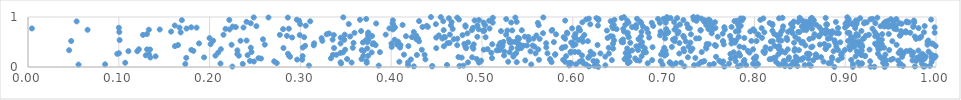
| Category | Series 0 |
|---|---|
| 0.9435141385175999 | 0.001 |
| 0.9084288971514204 | 0.002 |
| 0.8880947690722107 | 0.003 |
| 0.628026446844812 | 0.004 |
| 0.9321128601831961 | 0.005 |
| 0.9865255477891635 | 0.006 |
| 0.9278212670340489 | 0.007 |
| 0.7668587768886409 | 0.008 |
| 0.22507568513316045 | 0.009 |
| 0.8394012127995558 | 0.01 |
| 0.6178031120283696 | 0.011 |
| 0.9767485609237834 | 0.012 |
| 0.42494053328763504 | 0.013 |
| 0.7228866971198246 | 0.014 |
| 0.4448520454053059 | 0.015 |
| 0.7818662722988369 | 0.016 |
| 0.44540230513710366 | 0.017 |
| 0.8336374554361493 | 0.018 |
| 0.8473525703792806 | 0.019 |
| 0.9636773305580686 | 0.02 |
| 0.9932818365566519 | 0.021 |
| 0.475260327885379 | 0.022 |
| 0.6238320365783764 | 0.023 |
| 0.9882404270761533 | 0.024 |
| 0.8620616347082107 | 0.025 |
| 0.8013576877919077 | 0.026 |
| 0.47946430670365237 | 0.027 |
| 0.3862320885327105 | 0.028 |
| 0.3094214604411192 | 0.029 |
| 0.8403205275369019 | 0.03 |
| 0.5961232999273615 | 0.031 |
| 0.784754832634466 | 0.032 |
| 0.9158591251884615 | 0.033 |
| 0.6358777440192309 | 0.034 |
| 0.7100502725932303 | 0.035 |
| 0.4185945826810302 | 0.036 |
| 0.7336318142562891 | 0.037 |
| 0.7909183708939838 | 0.038 |
| 0.8553732623515314 | 0.039 |
| 0.9597024253832728 | 0.04 |
| 0.4614372961981086 | 0.041 |
| 0.8025614220324851 | 0.042 |
| 0.8034377014498689 | 0.043 |
| 0.7506864057592679 | 0.044 |
| 0.6989292244538539 | 0.045 |
| 0.8286363449986983 | 0.046 |
| 0.8270068750161812 | 0.047 |
| 0.05564668857978383 | 0.048 |
| 0.6146939725939228 | 0.049 |
| 0.9452851322320792 | 0.05 |
| 0.8603343276518199 | 0.051 |
| 0.5541808769718293 | 0.052 |
| 0.08493068262620929 | 0.053 |
| 0.6035408192104315 | 0.054 |
| 0.7094698329048269 | 0.055 |
| 0.9085348400150789 | 0.056 |
| 0.8341292525490099 | 0.057 |
| 0.8037658858891946 | 0.058 |
| 0.7386931026975604 | 0.059 |
| 0.17323263273371303 | 0.06 |
| 0.843430276609089 | 0.061 |
| 0.23652005693875178 | 0.062 |
| 0.7553407661391937 | 0.063 |
| 0.9609606586618787 | 0.064 |
| 0.7984970587532397 | 0.065 |
| 0.7720598693835035 | 0.066 |
| 0.9844515701339607 | 0.067 |
| 0.9181361390796628 | 0.068 |
| 0.21198326543716162 | 0.069 |
| 0.3448616093847905 | 0.07 |
| 0.803062395204101 | 0.071 |
| 0.9183280397652249 | 0.072 |
| 0.8448207286356256 | 0.073 |
| 0.6117462422665264 | 0.074 |
| 0.6825237214495554 | 0.075 |
| 0.8816320289399248 | 0.076 |
| 0.7136475046084222 | 0.077 |
| 0.6607260725389088 | 0.078 |
| 0.27397489191241975 | 0.079 |
| 0.5980288233540304 | 0.08 |
| 0.9417392830158506 | 0.081 |
| 0.5961131611034594 | 0.082 |
| 0.8841406389262182 | 0.083 |
| 0.3730175445998012 | 0.084 |
| 0.10707982698208474 | 0.085 |
| 0.7067614147741073 | 0.086 |
| 0.7192534083729213 | 0.087 |
| 0.49663971114465955 | 0.088 |
| 0.35637734175507696 | 0.089 |
| 0.4184989490279276 | 0.09 |
| 0.7635894636873023 | 0.091 |
| 0.4845306553572182 | 0.092 |
| 0.914236162547848 | 0.093 |
| 0.3442242560586368 | 0.094 |
| 0.7068743073014219 | 0.095 |
| 0.7410971792819275 | 0.096 |
| 0.5382661882569967 | 0.097 |
| 0.576602034867824 | 0.098 |
| 0.8240215202730105 | 0.099 |
| 0.842693436385164 | 0.1 |
| 0.6262883866531663 | 0.101 |
| 0.6626715377488874 | 0.102 |
| 0.9952167824005834 | 0.103 |
| 0.5916329879165847 | 0.104 |
| 0.4089512369712137 | 0.105 |
| 0.5288659126670202 | 0.106 |
| 0.7434441293883413 | 0.107 |
| 0.8761490184337252 | 0.108 |
| 0.6075198771472788 | 0.109 |
| 0.24873711022167078 | 0.11 |
| 0.7657430486895122 | 0.111 |
| 0.7882248398491215 | 0.112 |
| 0.2711384705225066 | 0.113 |
| 0.6264167185956734 | 0.114 |
| 0.9275266226725014 | 0.115 |
| 0.779401156650229 | 0.116 |
| 0.7448229101388014 | 0.117 |
| 0.37273688162585705 | 0.118 |
| 0.6967532974647325 | 0.119 |
| 0.6227253981576489 | 0.12 |
| 0.24443361491462678 | 0.121 |
| 0.9781912035715612 | 0.122 |
| 0.8324313108101445 | 0.123 |
| 0.7613934552696022 | 0.124 |
| 0.4990488829159021 | 0.125 |
| 0.6101440682426211 | 0.126 |
| 0.8476217849040943 | 0.127 |
| 0.6734285889484047 | 0.128 |
| 0.9583123329467871 | 0.129 |
| 0.9450411955072819 | 0.13 |
| 0.9741321816108763 | 0.131 |
| 0.54768970047063 | 0.132 |
| 0.6596502156816774 | 0.133 |
| 0.8647230473309191 | 0.134 |
| 0.6705387450810054 | 0.135 |
| 0.8922960266278387 | 0.136 |
| 0.6430126263218102 | 0.137 |
| 0.6873853587969818 | 0.138 |
| 0.7889885758238244 | 0.139 |
| 0.9832227718085348 | 0.14 |
| 0.9066192444755617 | 0.141 |
| 0.9846726935649228 | 0.142 |
| 0.5893819164875 | 0.143 |
| 0.5627384160353995 | 0.144 |
| 0.9503247079982249 | 0.145 |
| 0.3019914128243669 | 0.146 |
| 0.8520908201450087 | 0.147 |
| 0.29641162763697637 | 0.148 |
| 0.9848061187155219 | 0.149 |
| 0.5751275516147146 | 0.15 |
| 0.4216415765260272 | 0.151 |
| 0.8510289660863317 | 0.152 |
| 0.4376542269973591 | 0.153 |
| 0.8374064922402412 | 0.154 |
| 0.816733854584339 | 0.155 |
| 0.6569936727038088 | 0.156 |
| 0.5749413976711607 | 0.157 |
| 0.367325706435899 | 0.158 |
| 0.3514196145559376 | 0.159 |
| 0.8477160492246847 | 0.16 |
| 0.8190122347763199 | 0.161 |
| 0.4941073983302974 | 0.162 |
| 0.9525349230147732 | 0.163 |
| 0.9873912280539967 | 0.164 |
| 0.8857105298019818 | 0.165 |
| 0.8011678967298949 | 0.166 |
| 0.85929710926485 | 0.167 |
| 0.8461778457724604 | 0.168 |
| 0.2566217904529745 | 0.169 |
| 0.7740760130297377 | 0.17 |
| 0.6687050691685186 | 0.171 |
| 0.7993096496653893 | 0.172 |
| 0.9973931144365776 | 0.173 |
| 0.3336082084267009 | 0.174 |
| 0.9401045170864456 | 0.175 |
| 0.9430429024629676 | 0.176 |
| 0.2538297810334048 | 0.177 |
| 0.5110359578787965 | 0.178 |
| 0.9955253639912921 | 0.179 |
| 0.853908656906808 | 0.18 |
| 0.7349562953569444 | 0.181 |
| 0.8962422598696603 | 0.182 |
| 0.17429521821063498 | 0.183 |
| 0.8216300108126642 | 0.184 |
| 0.6170969576169659 | 0.185 |
| 0.9789864269489768 | 0.186 |
| 0.8232084852190503 | 0.187 |
| 0.4776275764555077 | 0.188 |
| 0.9952241513268374 | 0.189 |
| 0.13475074266772558 | 0.19 |
| 0.8381336586003342 | 0.191 |
| 0.19392688567500704 | 0.192 |
| 0.8854837261667257 | 0.193 |
| 0.48916089548347985 | 0.194 |
| 0.7267652153767711 | 0.195 |
| 0.8734653395136986 | 0.196 |
| 0.6591736879321749 | 0.197 |
| 0.8690640578756771 | 0.198 |
| 0.7789106561514508 | 0.199 |
| 0.4740443712796597 | 0.2 |
| 0.8676821355333341 | 0.201 |
| 0.9385498511144555 | 0.202 |
| 0.9626561152805713 | 0.203 |
| 0.757730993674917 | 0.204 |
| 0.28860475800327423 | 0.205 |
| 0.8455944010882606 | 0.206 |
| 0.6357702704199021 | 0.207 |
| 0.5345260215610343 | 0.208 |
| 0.8019494814538256 | 0.209 |
| 0.9994873011392063 | 0.21 |
| 0.9886742769579934 | 0.211 |
| 0.911421140183047 | 0.212 |
| 0.1405001953216295 | 0.213 |
| 0.6621217914297407 | 0.214 |
| 0.618381019308238 | 0.215 |
| 0.592577552855794 | 0.216 |
| 0.6758357062827078 | 0.217 |
| 0.3024424097243147 | 0.218 |
| 0.9220239844709457 | 0.219 |
| 0.9824589830068939 | 0.22 |
| 0.998974574452004 | 0.221 |
| 0.28753201392630756 | 0.222 |
| 0.36931360892823584 | 0.223 |
| 0.37453499559517034 | 0.224 |
| 0.92162183489275 | 0.225 |
| 0.23217397377495697 | 0.226 |
| 0.20644001365635611 | 0.227 |
| 0.7841714168372236 | 0.228 |
| 0.7011120622152577 | 0.229 |
| 0.9737681192090062 | 0.23 |
| 0.5242921855878709 | 0.231 |
| 0.6101436350745529 | 0.232 |
| 0.9859953830357254 | 0.233 |
| 0.12970308614464343 | 0.234 |
| 0.5349675060563073 | 0.235 |
| 0.24176955557808633 | 0.236 |
| 0.9182175621492139 | 0.237 |
| 0.8682420280125379 | 0.238 |
| 0.8955999777889398 | 0.239 |
| 0.9178590984884998 | 0.24 |
| 0.4282900596569109 | 0.241 |
| 0.3357701764623243 | 0.242 |
| 0.43679172732002836 | 0.243 |
| 0.3395496793557593 | 0.244 |
| 0.5805469466910432 | 0.245 |
| 0.8958132891904754 | 0.246 |
| 0.4140574895768102 | 0.247 |
| 0.6603100890161888 | 0.248 |
| 0.944314457946057 | 0.249 |
| 0.9950181173542662 | 0.25 |
| 0.6973107983429941 | 0.251 |
| 0.8676990084018604 | 0.252 |
| 0.702943592654176 | 0.253 |
| 0.8263368863303139 | 0.254 |
| 0.5807583554942506 | 0.255 |
| 0.8609334697033897 | 0.256 |
| 0.6227926771707116 | 0.257 |
| 0.13314920015335274 | 0.258 |
| 0.2305162192940431 | 0.259 |
| 0.9638006212391633 | 0.26 |
| 0.7735593659783847 | 0.261 |
| 0.9850507233909908 | 0.262 |
| 0.09827743237930264 | 0.263 |
| 0.8579496797376436 | 0.264 |
| 0.2863499923006928 | 0.265 |
| 0.6997117718564855 | 0.266 |
| 0.8594933335895718 | 0.267 |
| 0.9360496860324868 | 0.268 |
| 0.7172433083180378 | 0.269 |
| 0.6397475905318037 | 0.27 |
| 0.6304095075210544 | 0.271 |
| 0.5589978791062472 | 0.272 |
| 0.5720979700862855 | 0.273 |
| 0.8963201557082763 | 0.274 |
| 0.10021339070962043 | 0.275 |
| 0.7828874237814578 | 0.276 |
| 0.5375539423411192 | 0.277 |
| 0.8112045005568749 | 0.278 |
| 0.9146447886052931 | 0.279 |
| 0.6582342151119461 | 0.28 |
| 0.34412013451820744 | 0.281 |
| 0.958900997629742 | 0.282 |
| 0.5103102689371339 | 0.283 |
| 0.961956855015502 | 0.284 |
| 0.9627605908589199 | 0.285 |
| 0.597496111080429 | 0.286 |
| 0.794585594834686 | 0.287 |
| 0.20947692887283242 | 0.288 |
| 0.9750120717731277 | 0.289 |
| 0.8338022541112214 | 0.29 |
| 0.37849221600450933 | 0.291 |
| 0.3469277067437183 | 0.292 |
| 0.6805268157491206 | 0.293 |
| 0.5303395181843776 | 0.294 |
| 0.7770947279284885 | 0.295 |
| 0.6063814718986812 | 0.296 |
| 0.387626282872627 | 0.297 |
| 0.6786000107543027 | 0.298 |
| 0.7419685656775854 | 0.299 |
| 0.2461009509550386 | 0.3 |
| 0.6023283050799166 | 0.301 |
| 0.661979947085951 | 0.302 |
| 0.6782042953400255 | 0.303 |
| 0.8295881151719511 | 0.304 |
| 0.6613583134945599 | 0.305 |
| 0.6195424854818541 | 0.306 |
| 0.5978876221716719 | 0.307 |
| 0.9918389755185723 | 0.308 |
| 0.5247473579344558 | 0.309 |
| 0.8098864750473154 | 0.31 |
| 0.8116400972003961 | 0.311 |
| 0.5533811667735291 | 0.312 |
| 0.9128096014096997 | 0.313 |
| 0.7225438033558237 | 0.314 |
| 0.12037238559471397 | 0.315 |
| 0.8872081232866191 | 0.316 |
| 0.11058061644640649 | 0.317 |
| 0.967289248124778 | 0.318 |
| 0.9709736194924934 | 0.319 |
| 0.6995321341061669 | 0.32 |
| 0.792831292221641 | 0.321 |
| 0.7298577197072112 | 0.322 |
| 0.18215515532207582 | 0.323 |
| 0.36969103023078154 | 0.324 |
| 0.8440969867360049 | 0.325 |
| 0.9181360616612526 | 0.326 |
| 0.702166980809526 | 0.327 |
| 0.9717606573494377 | 0.328 |
| 0.9806259635472654 | 0.329 |
| 0.8296922244193766 | 0.33 |
| 0.6653364228708941 | 0.331 |
| 0.9610016239063922 | 0.332 |
| 0.23062937119965954 | 0.333 |
| 0.5177012448107932 | 0.334 |
| 0.5161102574445077 | 0.335 |
| 0.04529880773374029 | 0.336 |
| 0.84901452340932 | 0.337 |
| 0.36758082485440813 | 0.338 |
| 0.6718502129984719 | 0.339 |
| 0.9484706684121432 | 0.34 |
| 0.8996118964908861 | 0.341 |
| 0.891975057868185 | 0.342 |
| 0.17986060674546267 | 0.343 |
| 0.5199043312573906 | 0.344 |
| 0.4337031224673654 | 0.345 |
| 0.5019430144961707 | 0.346 |
| 0.34936988714248784 | 0.347 |
| 0.9268371073345241 | 0.348 |
| 0.9054480323582501 | 0.349 |
| 0.13437644075688515 | 0.35 |
| 0.5620430221718816 | 0.351 |
| 0.13112799171576395 | 0.352 |
| 0.836713875541385 | 0.353 |
| 0.7985449962414952 | 0.354 |
| 0.12208297780306943 | 0.355 |
| 0.21239917861700186 | 0.356 |
| 0.8269989369109069 | 0.357 |
| 0.506177421818127 | 0.358 |
| 0.9364923379798501 | 0.359 |
| 0.8445540552828523 | 0.36 |
| 0.7219180106230613 | 0.361 |
| 0.8174317886776188 | 0.362 |
| 0.878509054693779 | 0.363 |
| 0.8784885646526137 | 0.364 |
| 0.5401307851370031 | 0.365 |
| 0.49047647207325196 | 0.366 |
| 0.7317618060740776 | 0.367 |
| 0.6444579143623955 | 0.368 |
| 0.7470660594489528 | 0.369 |
| 0.9388562397681479 | 0.37 |
| 0.6599107044324225 | 0.371 |
| 0.37369260106992763 | 0.372 |
| 0.5200482199047948 | 0.373 |
| 0.5878439905978383 | 0.374 |
| 0.6792947775459564 | 0.375 |
| 0.4824981902154801 | 0.376 |
| 0.4496322928544366 | 0.377 |
| 0.5431436260341749 | 0.378 |
| 0.28134805159646925 | 0.379 |
| 0.3370845630268743 | 0.38 |
| 0.5325070012388611 | 0.381 |
| 0.5393609768975988 | 0.382 |
| 0.7007333862951586 | 0.383 |
| 0.3576714232998761 | 0.384 |
| 0.6395456338642134 | 0.385 |
| 0.2453449040283705 | 0.386 |
| 0.9427079427545988 | 0.387 |
| 0.3026320602971607 | 0.388 |
| 0.40969363353997645 | 0.389 |
| 0.7883854444297661 | 0.39 |
| 0.5888626719131426 | 0.391 |
| 0.8258732945263156 | 0.392 |
| 0.5707981955813413 | 0.393 |
| 0.8123415447359951 | 0.394 |
| 0.8625379206088795 | 0.395 |
| 0.6878141125749804 | 0.396 |
| 0.7467940372889037 | 0.397 |
| 0.9184198301672712 | 0.398 |
| 0.826573921471983 | 0.399 |
| 0.4894362648073489 | 0.4 |
| 0.7090815091359928 | 0.401 |
| 0.4004926400600646 | 0.402 |
| 0.9099197330205884 | 0.403 |
| 0.5917198460385733 | 0.404 |
| 0.48168789389996625 | 0.405 |
| 0.5579221364364432 | 0.406 |
| 0.8902331043052732 | 0.407 |
| 0.8639726701969603 | 0.408 |
| 0.7836256945888486 | 0.409 |
| 0.7274999520643564 | 0.41 |
| 0.9044857220174011 | 0.411 |
| 0.5221087183411928 | 0.412 |
| 0.916538713546549 | 0.413 |
| 0.6699920383753777 | 0.414 |
| 0.45805236587501086 | 0.415 |
| 0.918584662798481 | 0.416 |
| 0.16184592400207798 | 0.417 |
| 0.4189618129122762 | 0.418 |
| 0.8272456957873446 | 0.419 |
| 0.9995571262167786 | 0.42 |
| 0.7576575642544476 | 0.421 |
| 0.676360598145453 | 0.422 |
| 0.8221900437821609 | 0.423 |
| 0.3052406511335044 | 0.424 |
| 0.6738061113207587 | 0.425 |
| 0.5453384707176944 | 0.426 |
| 0.8817808056071675 | 0.427 |
| 0.5184013632436153 | 0.428 |
| 0.5557134865015827 | 0.429 |
| 0.6004186454746893 | 0.43 |
| 0.5494672368770704 | 0.431 |
| 0.8560843221377954 | 0.432 |
| 0.3146607238470034 | 0.433 |
| 0.9346571789701756 | 0.434 |
| 0.522647494055222 | 0.435 |
| 0.4726859333273983 | 0.436 |
| 0.3828335128911139 | 0.437 |
| 0.4102319937509621 | 0.438 |
| 0.1652466540387002 | 0.439 |
| 0.7565429987597593 | 0.44 |
| 0.6272274307486864 | 0.441 |
| 0.5419806245116773 | 0.442 |
| 0.9566392745968432 | 0.443 |
| 0.674542083848056 | 0.444 |
| 0.22420802570276732 | 0.445 |
| 0.990578637321993 | 0.446 |
| 0.26079959822356746 | 0.447 |
| 0.8720799523663876 | 0.448 |
| 0.4063452511122162 | 0.449 |
| 0.9181283481571048 | 0.45 |
| 0.6029496066446813 | 0.451 |
| 0.7662581753448363 | 0.452 |
| 0.4908912364153102 | 0.453 |
| 0.9402873455876009 | 0.454 |
| 0.5113017464724376 | 0.455 |
| 0.3795426637993019 | 0.456 |
| 0.7498063455914742 | 0.457 |
| 0.2010997608608842 | 0.458 |
| 0.74744832309226 | 0.459 |
| 0.9380831912474746 | 0.46 |
| 0.8769987983694072 | 0.461 |
| 0.9133499365361563 | 0.462 |
| 0.4805383787634747 | 0.463 |
| 0.6442270634757618 | 0.464 |
| 0.9965794719861308 | 0.465 |
| 0.5397234843000311 | 0.466 |
| 0.9955450723662386 | 0.467 |
| 0.9329089429802015 | 0.468 |
| 0.4003134262816763 | 0.469 |
| 0.7747005150317215 | 0.47 |
| 0.3442151774493508 | 0.471 |
| 0.18834792183409588 | 0.472 |
| 0.31516038384127576 | 0.473 |
| 0.8897234078052054 | 0.474 |
| 0.5706330812448428 | 0.475 |
| 0.3806005910345228 | 0.476 |
| 0.46197404423830435 | 0.477 |
| 0.9072270169250399 | 0.478 |
| 0.7173589599357393 | 0.479 |
| 0.4643321193732669 | 0.48 |
| 0.5201995592241648 | 0.481 |
| 0.358511402277241 | 0.482 |
| 0.8518173252067903 | 0.483 |
| 0.663305850250559 | 0.484 |
| 0.8437180584167098 | 0.485 |
| 0.5998575346554011 | 0.486 |
| 0.7784252883815787 | 0.487 |
| 0.530612977958119 | 0.488 |
| 0.7294769331437467 | 0.489 |
| 0.5982333517198741 | 0.49 |
| 0.36880520028003405 | 0.491 |
| 0.4846801111451947 | 0.492 |
| 0.8889904200508393 | 0.493 |
| 0.8946356434952599 | 0.494 |
| 0.6553944336612381 | 0.495 |
| 0.6541188962336243 | 0.496 |
| 0.37353649717866344 | 0.497 |
| 0.5791792655168065 | 0.498 |
| 0.6761744649227414 | 0.499 |
| 0.5328052479317535 | 0.5 |
| 0.8534365391672617 | 0.501 |
| 0.5361957261097727 | 0.502 |
| 0.5235046215213206 | 0.503 |
| 0.9906335038826248 | 0.504 |
| 0.4076086299487309 | 0.505 |
| 0.9149424063687972 | 0.506 |
| 0.61113786372918 | 0.507 |
| 0.9107127686841927 | 0.508 |
| 0.818081684566372 | 0.509 |
| 0.7766748466919147 | 0.51 |
| 0.7243755215321716 | 0.511 |
| 0.7654080268476807 | 0.512 |
| 0.712087227330725 | 0.513 |
| 0.43060905481321265 | 0.514 |
| 0.8202397053847681 | 0.515 |
| 0.9518871010043235 | 0.516 |
| 0.6165660591649876 | 0.517 |
| 0.7654008965680978 | 0.518 |
| 0.8023937755859234 | 0.519 |
| 0.0475637400006822 | 0.52 |
| 0.796640773909534 | 0.521 |
| 0.9032758434034796 | 0.522 |
| 0.32414430737865974 | 0.523 |
| 0.7764687353398514 | 0.524 |
| 0.2340399249088425 | 0.525 |
| 0.20386643910734037 | 0.526 |
| 0.6536716193630902 | 0.527 |
| 0.8297757119695718 | 0.528 |
| 0.24074187074352948 | 0.529 |
| 0.9914871223629784 | 0.53 |
| 0.937303484367962 | 0.531 |
| 0.7797447848935405 | 0.532 |
| 0.6454493414761603 | 0.533 |
| 0.8881833071255649 | 0.534 |
| 0.5394010518304557 | 0.535 |
| 0.5514616559402892 | 0.536 |
| 0.3722208161530812 | 0.537 |
| 0.10089359681549803 | 0.538 |
| 0.8267712290006078 | 0.539 |
| 0.8361203230716883 | 0.54 |
| 0.60630738490915 | 0.541 |
| 0.3750552709150331 | 0.542 |
| 0.9071319002340625 | 0.543 |
| 0.34836161541242994 | 0.544 |
| 0.4038439891465915 | 0.545 |
| 0.9403720925885825 | 0.546 |
| 0.33547418587210354 | 0.547 |
| 0.7103024761152593 | 0.548 |
| 0.7746764355728304 | 0.549 |
| 0.6553978368479605 | 0.55 |
| 0.9372825760057705 | 0.551 |
| 0.6731462013252749 | 0.552 |
| 0.5296735182312544 | 0.553 |
| 0.25878943896964823 | 0.554 |
| 0.4276477832911483 | 0.555 |
| 0.8485967184214304 | 0.556 |
| 0.46895565669266503 | 0.557 |
| 0.9194566296671938 | 0.558 |
| 0.6723830043696285 | 0.559 |
| 0.8605410758682701 | 0.56 |
| 0.42980019824931415 | 0.561 |
| 0.5635151904517826 | 0.562 |
| 0.9779708906650335 | 0.563 |
| 0.8809473212986011 | 0.564 |
| 0.4728677780700785 | 0.565 |
| 0.591562258127083 | 0.566 |
| 0.5408821919551707 | 0.567 |
| 0.5568099724482736 | 0.568 |
| 0.4562860403302079 | 0.569 |
| 0.7126193431076904 | 0.57 |
| 0.7358084798290735 | 0.571 |
| 0.7015763616860109 | 0.572 |
| 0.7390474294629483 | 0.573 |
| 0.92064976550189 | 0.574 |
| 0.6100904733201555 | 0.575 |
| 0.9819330776049737 | 0.576 |
| 0.32334590222127624 | 0.577 |
| 0.19992776505026477 | 0.578 |
| 0.8834112541950111 | 0.579 |
| 0.7889356819577029 | 0.58 |
| 0.6383160664948757 | 0.581 |
| 0.8083348992359215 | 0.582 |
| 0.8355428749921336 | 0.583 |
| 0.6022638895380528 | 0.584 |
| 0.8645857288195397 | 0.585 |
| 0.34437529895918295 | 0.586 |
| 0.5394581917774802 | 0.587 |
| 0.449625176313016 | 0.588 |
| 0.6840696496952463 | 0.589 |
| 0.29090753523337043 | 0.59 |
| 0.7226246464621484 | 0.591 |
| 0.42765759052856944 | 0.592 |
| 0.45922809985560764 | 0.593 |
| 0.6615963652451561 | 0.594 |
| 0.503947308862989 | 0.595 |
| 0.3041712470085858 | 0.596 |
| 0.5899552462659479 | 0.597 |
| 0.4227979704718341 | 0.598 |
| 0.9065342243326265 | 0.599 |
| 0.4583651999266102 | 0.6 |
| 0.5510236999558838 | 0.601 |
| 0.845036947186249 | 0.602 |
| 0.7827385619549402 | 0.603 |
| 0.4948819366285967 | 0.604 |
| 0.759655217079795 | 0.605 |
| 0.9836827903563611 | 0.606 |
| 0.547102978496495 | 0.607 |
| 0.6016170597261642 | 0.608 |
| 0.9766891456480478 | 0.609 |
| 0.35480941186680526 | 0.61 |
| 0.6439502660658186 | 0.611 |
| 0.6022036995191435 | 0.612 |
| 0.8714149590778187 | 0.613 |
| 0.9330440000791485 | 0.614 |
| 0.6415275151549593 | 0.615 |
| 0.41633263470349724 | 0.616 |
| 0.6751311078346068 | 0.617 |
| 0.9117345216836048 | 0.618 |
| 0.8708091556128063 | 0.619 |
| 0.37893682373012916 | 0.62 |
| 0.7731481931950571 | 0.621 |
| 0.7216313030907051 | 0.622 |
| 0.28518671281998853 | 0.623 |
| 0.8251851950061154 | 0.624 |
| 0.42761636125272295 | 0.625 |
| 0.9228898693455779 | 0.626 |
| 0.37458549767123117 | 0.627 |
| 0.9601002279049721 | 0.628 |
| 0.9142631027407913 | 0.629 |
| 0.9356996047963645 | 0.63 |
| 0.5599234703081413 | 0.631 |
| 0.45243208996158335 | 0.632 |
| 0.9606922978527602 | 0.633 |
| 0.8250285941144322 | 0.634 |
| 0.6960772004534801 | 0.635 |
| 0.804329547711934 | 0.636 |
| 0.47855132859859273 | 0.637 |
| 0.2992732016967449 | 0.638 |
| 0.3368048098787999 | 0.639 |
| 0.6126701974817741 | 0.64 |
| 0.8280456452569686 | 0.641 |
| 0.12667127812984424 | 0.642 |
| 0.27736797195168783 | 0.643 |
| 0.9261216922937328 | 0.644 |
| 0.21529793159534627 | 0.645 |
| 0.5265394658027195 | 0.646 |
| 0.3487861561479286 | 0.647 |
| 0.39397160974921663 | 0.648 |
| 0.46457645531905367 | 0.649 |
| 0.6603997797204328 | 0.65 |
| 0.9341809214509916 | 0.651 |
| 0.8039997398445826 | 0.652 |
| 0.5815768463350518 | 0.653 |
| 0.7300991484095649 | 0.654 |
| 0.32895590704046807 | 0.655 |
| 0.8661802830409656 | 0.656 |
| 0.940769648885264 | 0.657 |
| 0.13097873029206553 | 0.658 |
| 0.9122929059915182 | 0.659 |
| 0.9479598929940639 | 0.66 |
| 0.8218479458509231 | 0.661 |
| 0.3746851423922214 | 0.662 |
| 0.6029625758492992 | 0.663 |
| 0.8849668025075439 | 0.664 |
| 0.7014970770200574 | 0.665 |
| 0.878486097978411 | 0.666 |
| 0.7651366445959608 | 0.667 |
| 0.7154289397825566 | 0.668 |
| 0.8736752251329726 | 0.669 |
| 0.33150044124321454 | 0.67 |
| 0.5940077534761699 | 0.671 |
| 0.48392631051158796 | 0.672 |
| 0.7529121619892482 | 0.673 |
| 0.8930233363297462 | 0.674 |
| 0.8420294541060037 | 0.675 |
| 0.5672477027866549 | 0.676 |
| 0.704044998032008 | 0.677 |
| 0.9622789710754753 | 0.678 |
| 0.8902920649009007 | 0.679 |
| 0.6829933647280085 | 0.68 |
| 0.8828870773810421 | 0.681 |
| 0.9046529929534834 | 0.682 |
| 0.359566219348172 | 0.683 |
| 0.9716906628803063 | 0.684 |
| 0.9026899000297742 | 0.685 |
| 0.9985002060960401 | 0.686 |
| 0.5935310538302739 | 0.687 |
| 0.660388468335154 | 0.688 |
| 0.8795019696904606 | 0.689 |
| 0.9669110638179634 | 0.69 |
| 0.37471202906582624 | 0.691 |
| 0.16814185881152777 | 0.692 |
| 0.8109745482738898 | 0.693 |
| 0.9866981311887917 | 0.694 |
| 0.8834249465204399 | 0.695 |
| 0.7051341538819734 | 0.696 |
| 0.882043231827646 | 0.697 |
| 0.8496144633896945 | 0.698 |
| 0.10053162607622912 | 0.699 |
| 0.4248341581056946 | 0.7 |
| 0.7040644909147067 | 0.701 |
| 0.8482751488753656 | 0.702 |
| 0.9324486133403198 | 0.703 |
| 0.837067785841157 | 0.704 |
| 0.8295828863718285 | 0.705 |
| 0.6756723680035781 | 0.706 |
| 0.7165021617100877 | 0.707 |
| 0.1576051752924168 | 0.708 |
| 0.6966460977417658 | 0.709 |
| 0.6563251142865709 | 0.71 |
| 0.7954767016558341 | 0.711 |
| 0.7794783091349886 | 0.712 |
| 0.8796583889717013 | 0.713 |
| 0.8859656552410546 | 0.714 |
| 0.9667290383726787 | 0.715 |
| 0.961635616115182 | 0.716 |
| 0.7825599906530175 | 0.717 |
| 0.5209344918887318 | 0.718 |
| 0.3668480993619392 | 0.719 |
| 0.9178539743001052 | 0.72 |
| 0.8000626154902357 | 0.721 |
| 0.5022820006934497 | 0.722 |
| 0.7529575966403291 | 0.723 |
| 0.5010748240086964 | 0.724 |
| 0.8407278699852925 | 0.725 |
| 0.5766408634403988 | 0.726 |
| 0.8198313748746188 | 0.727 |
| 0.6375606908864595 | 0.728 |
| 0.5279195864178955 | 0.729 |
| 0.5024300434891771 | 0.73 |
| 0.5332817129237719 | 0.731 |
| 0.7406954039744181 | 0.732 |
| 0.6080287692375397 | 0.733 |
| 0.8398113117039518 | 0.734 |
| 0.5438260692463048 | 0.735 |
| 0.7408199793180529 | 0.736 |
| 0.48885331286342293 | 0.737 |
| 0.4578180612494229 | 0.738 |
| 0.8571034397607394 | 0.739 |
| 0.6067784010216631 | 0.74 |
| 0.5773646743918163 | 0.741 |
| 0.8738946892562742 | 0.742 |
| 0.8542073775748464 | 0.743 |
| 0.06559901783034539 | 0.744 |
| 0.13311419962585957 | 0.745 |
| 0.8310611984227263 | 0.746 |
| 0.8790067210188535 | 0.747 |
| 0.7120286628796086 | 0.748 |
| 0.7673905098070433 | 0.749 |
| 0.14509838623826765 | 0.75 |
| 0.2219927064508309 | 0.751 |
| 0.401933126666455 | 0.752 |
| 0.7987707821156338 | 0.753 |
| 0.9564491024612031 | 0.754 |
| 0.49627357553488005 | 0.755 |
| 0.7493946470807318 | 0.756 |
| 0.6482473332266282 | 0.757 |
| 0.2809477411625818 | 0.758 |
| 0.7543380801744364 | 0.759 |
| 0.7028498785511745 | 0.76 |
| 0.46771103729473984 | 0.761 |
| 0.6813890275608981 | 0.762 |
| 0.21753455700136526 | 0.763 |
| 0.6555733459806595 | 0.764 |
| 0.9540486784001209 | 0.765 |
| 0.2873073112205401 | 0.766 |
| 0.8634373725459603 | 0.767 |
| 0.9300454009235979 | 0.768 |
| 0.1745681437294394 | 0.769 |
| 0.5082939180176965 | 0.77 |
| 0.004287652563866429 | 0.771 |
| 0.39803743027648475 | 0.772 |
| 0.5991831603447313 | 0.773 |
| 0.6443265227464252 | 0.774 |
| 0.7289178496669411 | 0.775 |
| 0.808024574602653 | 0.776 |
| 0.9808391777058859 | 0.777 |
| 0.9109804466471743 | 0.778 |
| 0.7570639580036982 | 0.779 |
| 0.8921057043015537 | 0.78 |
| 0.7269486787762087 | 0.781 |
| 0.6065424100558379 | 0.782 |
| 0.49004287048104267 | 0.783 |
| 0.6696561662908818 | 0.784 |
| 0.10003404705886154 | 0.785 |
| 0.7526680842228467 | 0.786 |
| 0.1856386607108721 | 0.787 |
| 0.16686529165434938 | 0.788 |
| 0.2373398812115154 | 0.789 |
| 0.8998005138631375 | 0.79 |
| 0.40419047205819825 | 0.791 |
| 0.7830484644262674 | 0.792 |
| 0.9984941279626879 | 0.793 |
| 0.17970986099935837 | 0.794 |
| 0.8715755175787105 | 0.795 |
| 0.766860823646809 | 0.796 |
| 0.6653354655173125 | 0.797 |
| 0.2288454344162273 | 0.798 |
| 0.8420759178282191 | 0.799 |
| 0.4344546024077096 | 0.8 |
| 0.7748467186993225 | 0.801 |
| 0.9748939871808664 | 0.802 |
| 0.44033710199218346 | 0.803 |
| 0.7139152517265567 | 0.804 |
| 0.8610712334259221 | 0.805 |
| 0.9476458705625408 | 0.806 |
| 0.48195130705047173 | 0.807 |
| 0.2255308210241429 | 0.808 |
| 0.9430630314894162 | 0.809 |
| 0.6772968860549926 | 0.81 |
| 0.8522325189939903 | 0.811 |
| 0.6434200850902206 | 0.812 |
| 0.8316366279121226 | 0.813 |
| 0.9467845192947131 | 0.814 |
| 0.93892764575736 | 0.815 |
| 0.9493394937264653 | 0.816 |
| 0.2515600375770398 | 0.817 |
| 0.9753842143264903 | 0.818 |
| 0.9875303095620117 | 0.819 |
| 0.8603172560099703 | 0.82 |
| 0.6885223871138371 | 0.821 |
| 0.9538653721705079 | 0.822 |
| 0.4391362935009101 | 0.823 |
| 0.856960754264322 | 0.824 |
| 0.7849617768793629 | 0.825 |
| 0.3058422812918047 | 0.826 |
| 0.7525199088691182 | 0.827 |
| 0.9558202614628254 | 0.828 |
| 0.6276230209380024 | 0.829 |
| 0.16163317764170815 | 0.83 |
| 0.9021905243457835 | 0.831 |
| 0.4816823704893791 | 0.832 |
| 0.4949793184840078 | 0.833 |
| 0.4657769736072511 | 0.834 |
| 0.7470743087666867 | 0.835 |
| 0.5623871307811865 | 0.836 |
| 0.8198995700407044 | 0.837 |
| 0.5033152954602513 | 0.838 |
| 0.6696620613417041 | 0.839 |
| 0.9439915628455322 | 0.84 |
| 0.4125202078246957 | 0.841 |
| 0.6451044966978214 | 0.842 |
| 0.951597614286454 | 0.843 |
| 0.6578751636003445 | 0.844 |
| 0.9028182195524719 | 0.845 |
| 0.8680325626942565 | 0.846 |
| 0.4022778092822006 | 0.847 |
| 0.8795151004152194 | 0.848 |
| 0.9119208270563075 | 0.849 |
| 0.7179669450268821 | 0.85 |
| 0.8792034549229774 | 0.851 |
| 0.8799697208667919 | 0.852 |
| 0.7258666179996646 | 0.853 |
| 0.6192425662436715 | 0.854 |
| 0.7818820751354159 | 0.855 |
| 0.8590943974810561 | 0.856 |
| 0.449167572679402 | 0.857 |
| 0.29971859528721234 | 0.858 |
| 0.3532979136091642 | 0.859 |
| 0.8403963932108706 | 0.86 |
| 0.8197584318075768 | 0.861 |
| 0.7527701708433273 | 0.862 |
| 0.907484555306104 | 0.863 |
| 0.9425718818281077 | 0.864 |
| 0.9621144031807997 | 0.865 |
| 0.8638598523046861 | 0.866 |
| 0.9003613076161139 | 0.867 |
| 0.9087568586715659 | 0.868 |
| 0.9074338491023506 | 0.869 |
| 0.383452127632532 | 0.87 |
| 0.9126125679433806 | 0.871 |
| 0.8421519262064782 | 0.872 |
| 0.9207786512140084 | 0.873 |
| 0.2453144454618401 | 0.874 |
| 0.40146619311505327 | 0.875 |
| 0.9426781007506936 | 0.876 |
| 0.9598434359471106 | 0.877 |
| 0.9331533250890683 | 0.878 |
| 0.8553251110621398 | 0.879 |
| 0.816804373086314 | 0.88 |
| 0.675296523173453 | 0.881 |
| 0.561505022079725 | 0.882 |
| 0.6959132136390933 | 0.883 |
| 0.6869772630136827 | 0.884 |
| 0.6613256562561898 | 0.885 |
| 0.7023151689652674 | 0.886 |
| 0.5118196784317437 | 0.887 |
| 0.5017741649295294 | 0.888 |
| 0.748607194336086 | 0.889 |
| 0.5321523971534843 | 0.89 |
| 0.9237056395566496 | 0.891 |
| 0.9700750397619455 | 0.892 |
| 0.6105088714430104 | 0.893 |
| 0.9213125815284006 | 0.894 |
| 0.9679319827483772 | 0.895 |
| 0.7566225357993293 | 0.896 |
| 0.9761695400409429 | 0.897 |
| 0.7116424508249352 | 0.898 |
| 0.4665130661813379 | 0.899 |
| 0.8897153741168261 | 0.9 |
| 0.8480878730862348 | 0.901 |
| 0.8595262723144363 | 0.902 |
| 0.5382132238504117 | 0.903 |
| 0.24063903453403246 | 0.904 |
| 0.7447584382663908 | 0.905 |
| 0.9444198344485345 | 0.906 |
| 0.7828421601172396 | 0.907 |
| 0.8562715668204084 | 0.908 |
| 0.8433135893369448 | 0.909 |
| 0.9675637023356553 | 0.91 |
| 0.6742077773869438 | 0.911 |
| 0.053573820986880016 | 0.912 |
| 0.9025159533579075 | 0.913 |
| 0.3107985183875319 | 0.914 |
| 0.6417758426449178 | 0.915 |
| 0.4573707452136231 | 0.916 |
| 0.7780274622717571 | 0.917 |
| 0.4306927482188657 | 0.918 |
| 0.9471277824065805 | 0.919 |
| 0.7806885406057755 | 0.92 |
| 0.8531998025924703 | 0.921 |
| 0.29858069968999634 | 0.922 |
| 0.9535426482592188 | 0.923 |
| 0.7362037552621599 | 0.924 |
| 0.913043057694811 | 0.925 |
| 0.5079177856937706 | 0.926 |
| 0.660074917251608 | 0.927 |
| 0.5916201668187356 | 0.928 |
| 0.9117473841932762 | 0.929 |
| 0.9755800940215871 | 0.93 |
| 0.4918287709256315 | 0.931 |
| 0.7509040591411318 | 0.932 |
| 0.40187536896984133 | 0.933 |
| 0.8653797658581891 | 0.934 |
| 0.7862826708300361 | 0.935 |
| 0.16942043705877796 | 0.936 |
| 0.7450251889313256 | 0.937 |
| 0.7218021953289969 | 0.938 |
| 0.6281575013825625 | 0.939 |
| 0.49659340436170885 | 0.94 |
| 0.2216917210548014 | 0.941 |
| 0.8065695991343915 | 0.942 |
| 0.8647998274874784 | 0.943 |
| 0.3656211042296278 | 0.944 |
| 0.6458540874562108 | 0.945 |
| 0.29606700134214814 | 0.946 |
| 0.7496260058221244 | 0.947 |
| 0.9946413232421549 | 0.948 |
| 0.4746307439287354 | 0.949 |
| 0.7331506834894471 | 0.95 |
| 0.6147727019594228 | 0.951 |
| 0.9558930912215556 | 0.952 |
| 0.9277471887443214 | 0.953 |
| 0.903859534698824 | 0.954 |
| 0.9564485430404541 | 0.955 |
| 0.9502966907779311 | 0.956 |
| 0.7037467659065794 | 0.957 |
| 0.5266536916962357 | 0.958 |
| 0.6281490315244398 | 0.959 |
| 0.3724637921916618 | 0.96 |
| 0.6938536588296331 | 0.961 |
| 0.9298759788636402 | 0.962 |
| 0.6999388960412888 | 0.963 |
| 0.6707243692145582 | 0.964 |
| 0.8621652128944115 | 0.965 |
| 0.8500454850282239 | 0.966 |
| 0.6176926975496362 | 0.967 |
| 0.7416182594881455 | 0.968 |
| 0.8629598304695361 | 0.969 |
| 0.7876709428038671 | 0.97 |
| 0.7848191369925878 | 0.971 |
| 0.8098775405999443 | 0.972 |
| 0.7032585301768837 | 0.973 |
| 0.8271451463523569 | 0.974 |
| 0.4635115338020048 | 0.975 |
| 0.9165331479448181 | 0.976 |
| 0.6260287137570406 | 0.977 |
| 0.7076515753883786 | 0.978 |
| 0.7149268706976326 | 0.979 |
| 0.6538361164421045 | 0.98 |
| 0.8784472716162492 | 0.981 |
| 0.8632523875738954 | 0.982 |
| 0.8498875139910951 | 0.983 |
| 0.8309003902245109 | 0.984 |
| 0.5119404730383411 | 0.985 |
| 0.9354014987208772 | 0.986 |
| 0.4727446647121445 | 0.987 |
| 0.28615260037486323 | 0.988 |
| 0.5367403307332987 | 0.989 |
| 0.2648421870841675 | 0.99 |
| 0.5675198154062094 | 0.991 |
| 0.24860322520179057 | 0.992 |
| 0.34720957017887544 | 0.993 |
| 0.7373702392535887 | 0.994 |
| 0.902361438005678 | 0.995 |
| 0.656406161689079 | 0.996 |
| 0.7036453859672216 | 0.997 |
| 0.4545897436372822 | 0.998 |
| 0.44378421707282667 | 0.999 |
| 0.7327031185568313 | 1 |